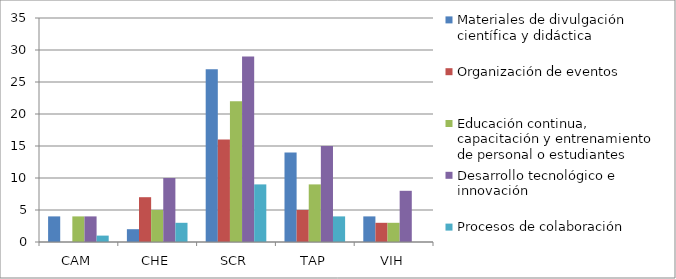
| Category | Materiales de divulgación científica y didáctica | Organización de eventos | Educación continua, capacitación y entrenamiento de personal o estudiantes | Desarrollo tecnológico e innovación | Procesos de colaboración |
|---|---|---|---|---|---|
| CAM | 4 | 0 | 4 | 4 | 1 |
| CHE | 2 | 7 | 5 | 10 | 3 |
| SCR | 27 | 16 | 22 | 29 | 9 |
| TAP | 14 | 5 | 9 | 15 | 4 |
| VIH | 4 | 3 | 3 | 8 | 0 |